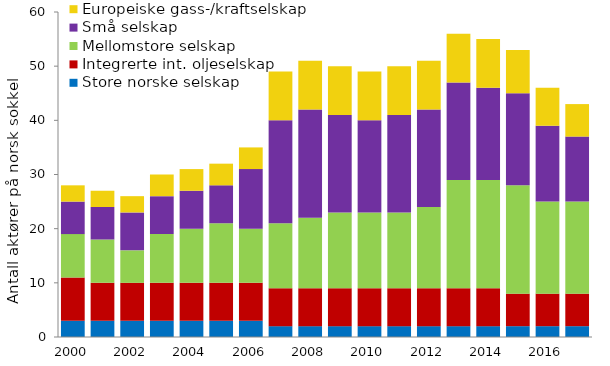
| Category | Store norske selskap | Integrerte int. oljeselskap | Mellomstore selskap | Små selskap | Europeiske gass-/kraftselskap |
|---|---|---|---|---|---|
| 2000.0 | 3 | 8 | 8 | 6 | 3 |
| 2001.0 | 3 | 7 | 8 | 6 | 3 |
| 2002.0 | 3 | 7 | 6 | 7 | 3 |
| 2003.0 | 3 | 7 | 9 | 7 | 4 |
| 2004.0 | 3 | 7 | 10 | 7 | 4 |
| 2005.0 | 3 | 7 | 11 | 7 | 4 |
| 2006.0 | 3 | 7 | 10 | 11 | 4 |
| 2007.0 | 2 | 7 | 12 | 19 | 9 |
| 2008.0 | 2 | 7 | 13 | 20 | 9 |
| 2009.0 | 2 | 7 | 14 | 18 | 9 |
| 2010.0 | 2 | 7 | 14 | 17 | 9 |
| 2011.0 | 2 | 7 | 14 | 18 | 9 |
| 2012.0 | 2 | 7 | 15 | 18 | 9 |
| 2013.0 | 2 | 7 | 20 | 18 | 9 |
| 2014.0 | 2 | 7 | 20 | 17 | 9 |
| 2015.0 | 2 | 6 | 20 | 17 | 8 |
| 2016.0 | 2 | 6 | 17 | 14 | 7 |
| 2017.0 | 2 | 6 | 17 | 12 | 6 |